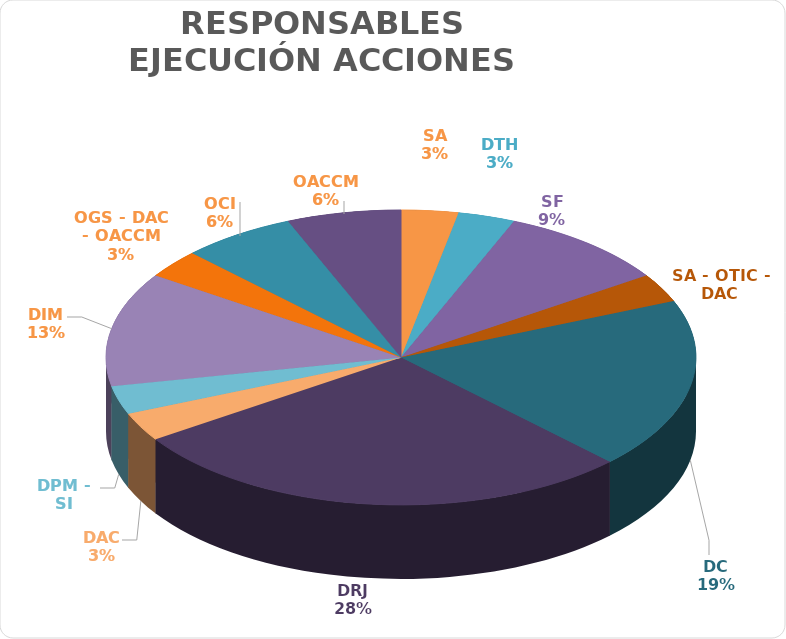
| Category | Series 0 |
|---|---|
| SA | 1 |
| DTH | 1 |
| SF | 3 |
| SA - OTIC - DAC | 1 |
| DC | 6 |
| DRJ | 9 |
| DAC | 1 |
| DPM - SI | 1 |
| DIM | 4 |
| OGS - DAC - OACCM | 1 |
| OCI | 2 |
| OACCM | 2 |